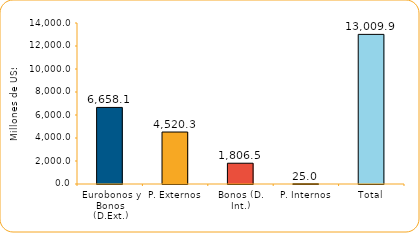
| Category | Series 1 |
|---|---|
| Eurobonos y Bonos (D.Ext.) | 6658.1 |
| P. Externos | 4520.3 |
| Bonos (D. Int.) | 1806.5 |
| P. Internos | 25 |
| Total | 13009.9 |